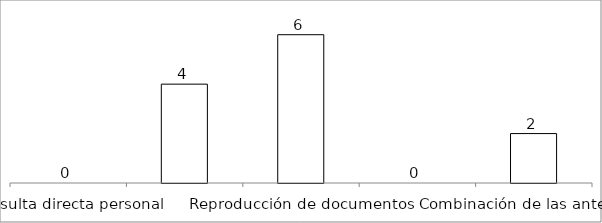
| Category | Series 0 |
|---|---|
| Consulta directa personal | 0 |
| Consulta directa electrónica | 4 |
| Reproducción de documentos | 6 |
| Elaboración de informes | 0 |
| Combinación de las anteriores | 2 |